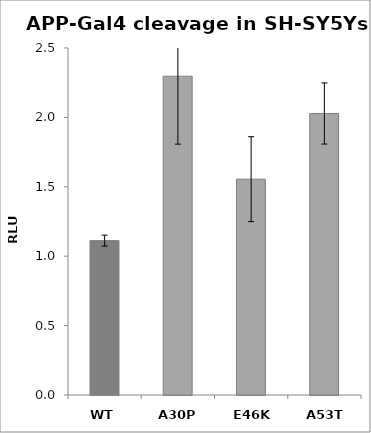
| Category | Series 0 |
|---|---|
| WT | 1.112 |
| A30P | 2.297 |
| E46K | 1.555 |
| A53T | 2.028 |